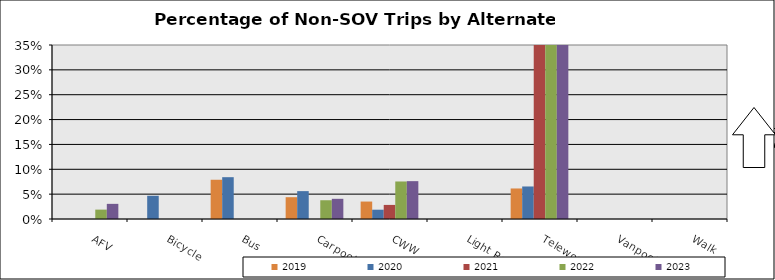
| Category | 2019 | 2020 | 2021 | 2022 | 2023 |
|---|---|---|---|---|---|
| AFV | 0 | 0 | 0 | 0.019 | 0.03 |
| Bicycle | 0 | 0.047 | 0 | 0 | 0 |
| Bus | 0.079 | 0.084 | 0 | 0 | 0 |
| Carpool | 0.044 | 0.056 | 0 | 0.038 | 0.041 |
| CWW | 0.035 | 0.019 | 0.028 | 0.075 | 0.076 |
| Light Rail | 0 | 0 | 0 | 0 | 0 |
| Telework | 0.061 | 0.065 | 0.502 | 0.519 | 0.416 |
| Vanpool | 0 | 0 | 0 | 0 | 0 |
| Walk | 0 | 0 | 0 | 0 | 0 |